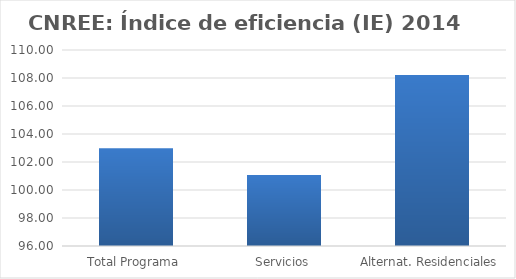
| Category | Índice de eficiencia (IE)  |
|---|---|
| Total Programa | 102.973 |
| Servicios | 101.063 |
| Alternat. Residenciales | 108.218 |